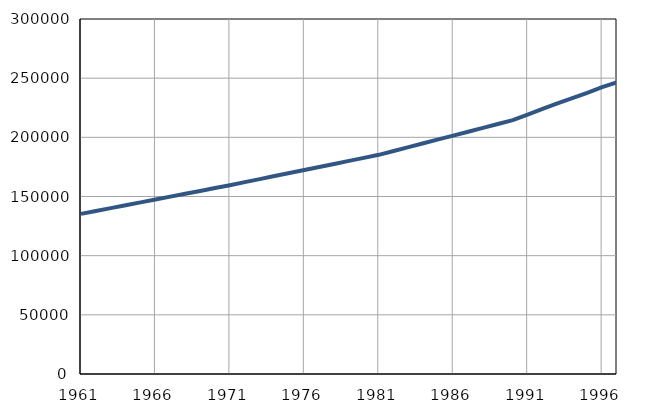
| Category | Population
size |
|---|---|
| 1961.0 | 135329 |
| 1962.0 | 137753 |
| 1963.0 | 140177 |
| 1964.0 | 142601 |
| 1965.0 | 145025 |
| 1966.0 | 147449 |
| 1967.0 | 149873 |
| 1968.0 | 152297 |
| 1969.0 | 154721 |
| 1970.0 | 157145 |
| 1971.0 | 159561 |
| 1972.0 | 162128 |
| 1973.0 | 164695 |
| 1974.0 | 167262 |
| 1975.0 | 169829 |
| 1976.0 | 172396 |
| 1977.0 | 174963 |
| 1978.0 | 177530 |
| 1979.0 | 180097 |
| 1980.0 | 182664 |
| 1981.0 | 185228 |
| 1982.0 | 188478 |
| 1983.0 | 191728 |
| 1984.0 | 194978 |
| 1985.0 | 198228 |
| 1986.0 | 201478 |
| 1987.0 | 204728 |
| 1988.0 | 207978 |
| 1989.0 | 211228 |
| 1990.0 | 214478 |
| 1991.0 | 219100 |
| 1992.0 | 224000 |
| 1993.0 | 228700 |
| 1994.0 | 233200 |
| 1995.0 | 237600 |
| 1996.0 | 242400 |
| 1997.0 | 246500 |